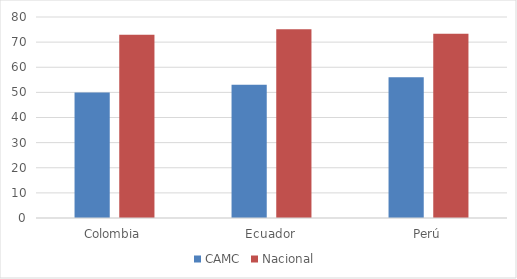
| Category | CAMC | Nacional  |
|---|---|---|
| Colombia | 50 | 72.984 |
| Ecuador | 53 | 75.151 |
| Perú | 56 | 73.306 |